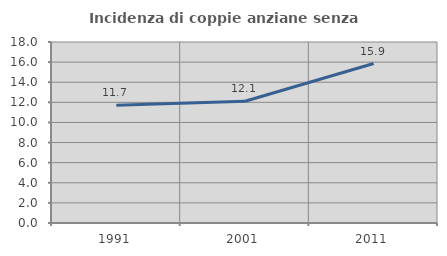
| Category | Incidenza di coppie anziane senza figli  |
|---|---|
| 1991.0 | 11.707 |
| 2001.0 | 12.102 |
| 2011.0 | 15.861 |